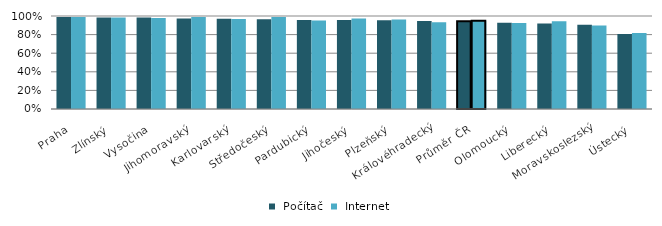
| Category |  Počítač |  Internet |
|---|---|---|
| Praha | 0.988 | 0.988 |
| Zlínský | 0.984 | 0.984 |
| Vysočina | 0.984 | 0.979 |
| Jihomoravský | 0.973 | 0.988 |
| Karlovarský | 0.97 | 0.969 |
| Středočeský | 0.966 | 0.989 |
| Pardubický | 0.958 | 0.951 |
| Jihočeský | 0.956 | 0.974 |
| Plzeňský | 0.954 | 0.963 |
| Královéhradecký | 0.946 | 0.933 |
| Průměr ČR | 0.943 | 0.949 |
| Olomoucký | 0.928 | 0.924 |
| Liberecký | 0.919 | 0.944 |
| Moravskoslezský | 0.905 | 0.899 |
| Ústecký | 0.807 | 0.818 |